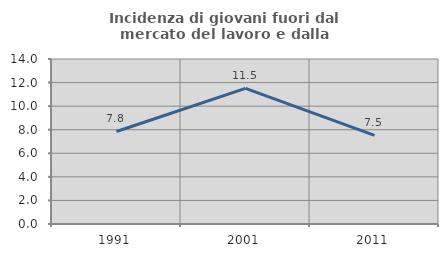
| Category | Incidenza di giovani fuori dal mercato del lavoro e dalla formazione  |
|---|---|
| 1991.0 | 7.849 |
| 2001.0 | 11.511 |
| 2011.0 | 7.525 |